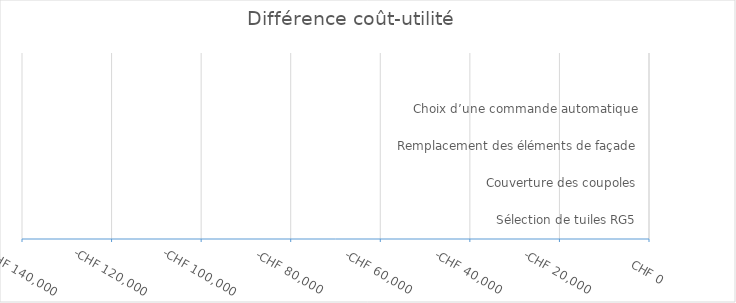
| Category | Différence coût-utilité |
|---|---|
| Sélection de tuiles RG5 | 0 |
| Couverture des coupoles | 0 |
| Remplacement des éléments de façade | 0 |
| Choix d’une commande automatique | 0 |